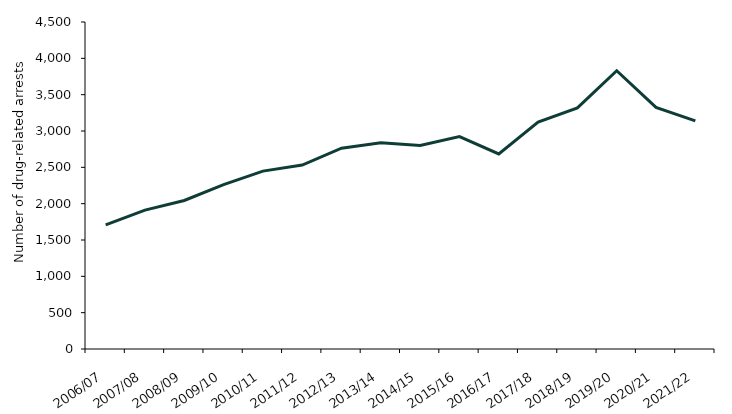
| Category | Drug-related arrests |
|---|---|
| 2006/07 | 1709 |
| 2007/08 | 1911 |
| 2008/09 | 2044 |
| 2009/10 | 2262 |
| 2010/11 | 2448 |
| 2011/12 | 2531 |
| 2012/13 | 2763 |
| 2013/14 | 2838 |
| 2014/15 | 2801 |
| 2015/16 | 2924 |
| 2016/17 | 2685 |
| 2017/18 | 3122 |
| 2018/19 | 3318 |
| 2019/20 | 3829 |
| 2020/21 | 3325 |
| 2021/22 | 3139 |